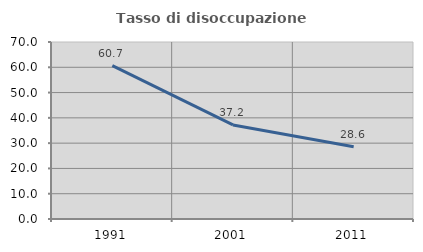
| Category | Tasso di disoccupazione giovanile  |
|---|---|
| 1991.0 | 60.664 |
| 2001.0 | 37.209 |
| 2011.0 | 28.571 |